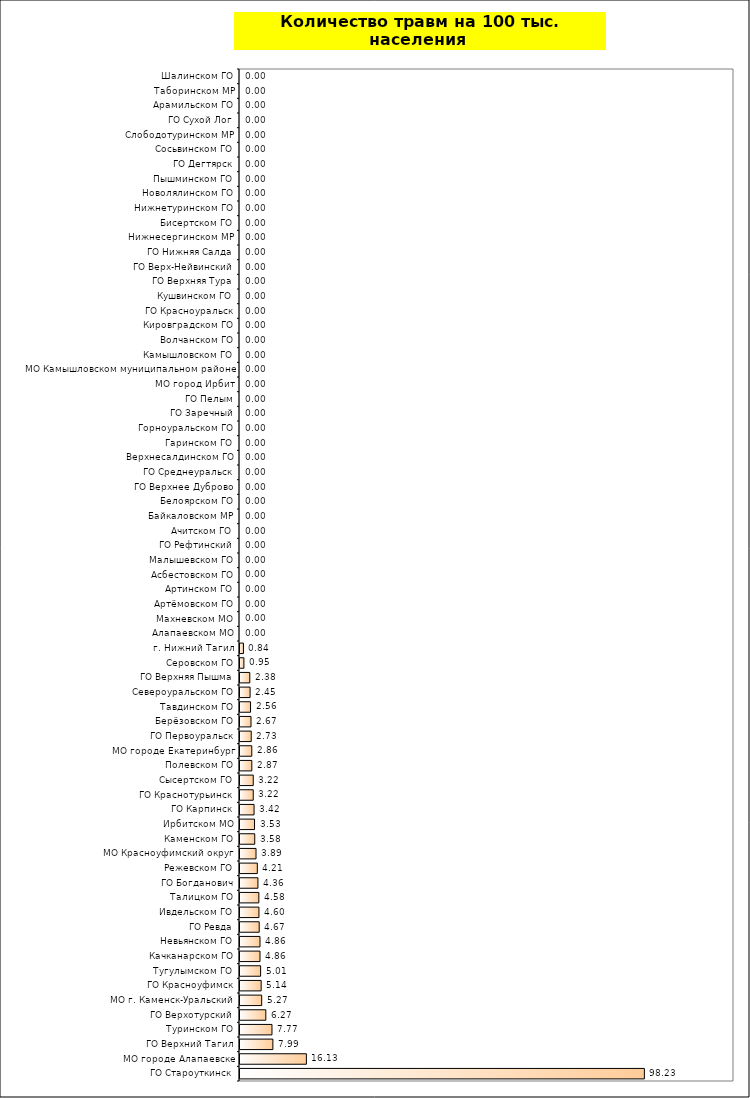
| Category | Series 0 |
|---|---|
| ГО Староуткинск | 98.232 |
| МО городе Алапаевске | 16.13 |
| ГО Верхний Тагил | 7.988 |
| Туринском ГО | 7.768 |
| ГО Верхотурский | 6.272 |
| МО г. Каменск-Уральский | 5.268 |
| ГО Красноуфимск | 5.139 |
| Тугулымском ГО | 5.01 |
| Качканарском ГО | 4.859 |
| Невьянском ГО | 4.857 |
| ГО Ревда | 4.665 |
| Ивдельском ГО | 4.602 |
| Талицком ГО | 4.577 |
| ГО Богданович | 4.36 |
| Режевском ГО | 4.209 |
| МО Красноуфимский округ | 3.893 |
| Каменском ГО | 3.582 |
| Ирбитском МО | 3.529 |
| ГО Карпинск | 3.416 |
| ГО Краснотурьинск | 3.22 |
| Сысертском ГО | 3.22 |
| Полевском ГО | 2.87 |
| МО городе Екатеринбург | 2.864 |
| ГО Первоуральск | 2.73 |
| Берёзовском ГО | 2.674 |
| Тавдинском ГО | 2.562 |
| Североуральском ГО | 2.455 |
| ГО Верхняя Пышма | 2.378 |
| Серовском ГО | 0.946 |
| г. Нижний Тагил | 0.841 |
| Алапаевском МО | 0 |
| Махневском МО | 0 |
| Артёмовском ГО | 0 |
| Артинском ГО | 0 |
| Асбестовском ГО | 0 |
| Малышевском ГО | 0 |
| ГО Рефтинский | 0 |
| Ачитском ГО | 0 |
| Байкаловском МР | 0 |
| Белоярском ГО | 0 |
| ГО Верхнее Дуброво | 0 |
| ГО Среднеуральск | 0 |
| Верхнесалдинском ГО | 0 |
| Гаринском ГО | 0 |
| Горноуральском ГО | 0 |
| ГО Заречный | 0 |
| ГО Пелым | 0 |
| МО город Ирбит | 0 |
| МО Камышловском муниципальном районе | 0 |
| Камышловском ГО | 0 |
| Волчанском ГО | 0 |
| Кировградском ГО | 0 |
| ГО Красноуральск | 0 |
| Кушвинском ГО | 0 |
| ГО Верхняя Тура | 0 |
| ГО Верх-Нейвинский | 0 |
| ГО Нижняя Салда | 0 |
| Нижнесергинском МР | 0 |
| Бисертском ГО | 0 |
| Нижнетуринском ГО | 0 |
| Новолялинском ГО | 0 |
| Пышминском ГО | 0 |
| ГО Дегтярск | 0 |
| Сосьвинском ГО | 0 |
| Слободотуринском МР | 0 |
| ГО Сухой Лог | 0 |
| Арамильском ГО | 0 |
| Таборинском МР | 0 |
| Шалинском ГО | 0 |